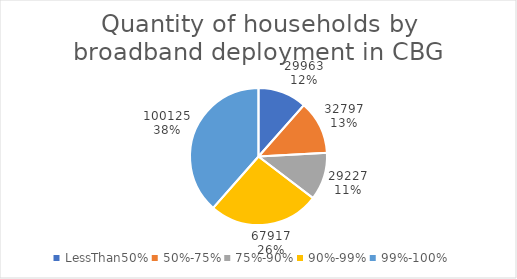
| Category | Series 0 |
|---|---|
| LessThan50% | 29963 |
| 50%-75% | 32797 |
| 75%-90% | 29227 |
| 90%-99% | 67917 |
| 99%-100% | 100125 |